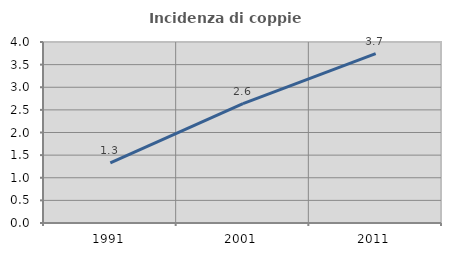
| Category | Incidenza di coppie miste |
|---|---|
| 1991.0 | 1.327 |
| 2001.0 | 2.637 |
| 2011.0 | 3.743 |